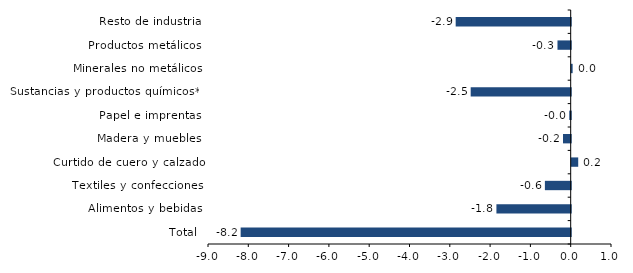
| Category | Series 0 |
|---|---|
| Total | -8.19 |
| Alimentos y bebidas | -1.843 |
| Textiles y confecciones | -0.641 |
| Curtido de cuero y calzado | 0.162 |
| Madera y muebles | -0.192 |
| Papel e imprentas | -0.035 |
| Sustancias y productos químicos** | -2.482 |
| Minerales no metálicos | 0.023 |
| Productos metálicos | -0.328 |
| Resto de industria | -2.854 |